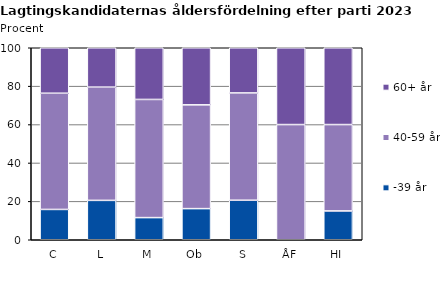
| Category | -39 år | 40-59 år | 60+ år |
|---|---|---|---|
| C | 15.789 | 60.526 | 23.684 |
| L | 20.513 | 58.974 | 20.513 |
| M | 11.538 | 61.538 | 26.923 |
| Ob | 16.216 | 54.054 | 29.73 |
| S | 20.588 | 55.882 | 23.529 |
| ÅF | 0 | 60 | 40 |
| HI | 15 | 45 | 40 |